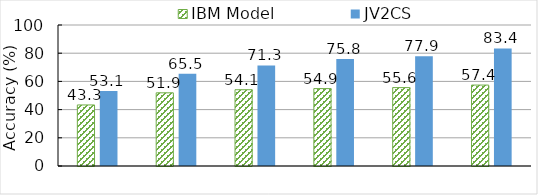
| Category | IBM Model | JV2CS |
|---|---|---|
| 0 | 43.3 | 53.14 |
| 1 | 51.9 | 65.465 |
| 2 | 54.1 | 71.279 |
| 3 | 54.9 | 75.814 |
| 4 | 55.6 | 77.907 |
| 5 | 57.4 | 83.372 |